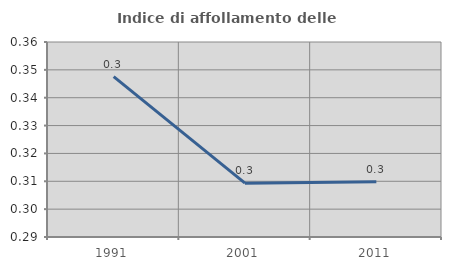
| Category | Indice di affollamento delle abitazioni  |
|---|---|
| 1991.0 | 0.348 |
| 2001.0 | 0.309 |
| 2011.0 | 0.31 |